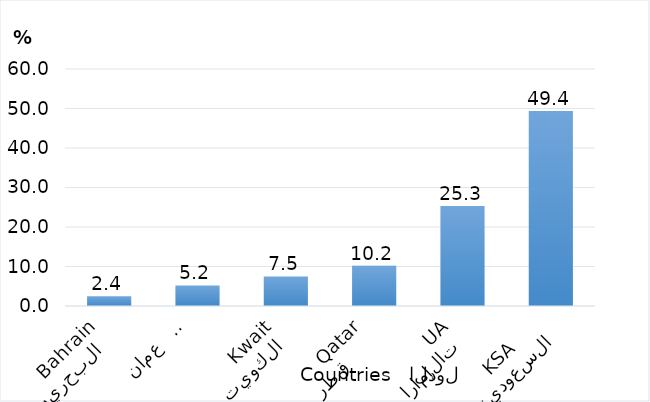
| Category | Series 0 |
|---|---|
| السعودية
 KSA      | 49.372 |
| الإمارات 
      UAE | 25.307 |
| قطر      
    Qatar | 10.184 |
| الكويت 
    Kwait | 7.471 |
| عمان   
  Oman | 5.216 |
| البحرين  
  Bahrain | 2.449 |